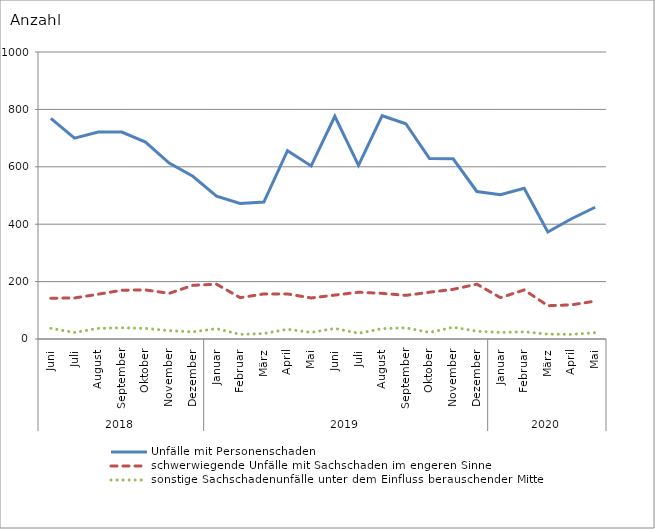
| Category | Unfälle mit Personenschaden | schwerwiegende Unfälle mit Sachschaden im engeren Sinne | sonstige Sachschadenunfälle unter dem Einfluss berauschender Mittel |
|---|---|---|---|
| 0 | 769 | 142 | 37 |
| 1 | 700 | 143 | 23 |
| 2 | 721 | 156 | 37 |
| 3 | 721 | 170 | 39 |
| 4 | 686 | 171 | 37 |
| 5 | 613 | 159 | 29 |
| 6 | 567 | 187 | 25 |
| 7 | 498 | 191 | 36 |
| 8 | 472 | 144 | 16 |
| 9 | 477 | 157 | 19 |
| 10 | 656 | 157 | 34 |
| 11 | 603 | 143 | 23 |
| 12 | 776 | 153 | 37 |
| 13 | 605 | 163 | 20 |
| 14 | 778 | 159 | 36 |
| 15 | 750 | 152 | 39 |
| 16 | 629 | 163 | 23 |
| 17 | 628 | 173 | 41 |
| 18 | 514 | 191 | 27 |
| 19 | 503 | 144 | 23 |
| 20 | 525 | 171 | 25 |
| 21 | 373 | 116 | 17 |
| 22 | 419 | 119 | 16 |
| 23 | 459 | 132 | 22 |